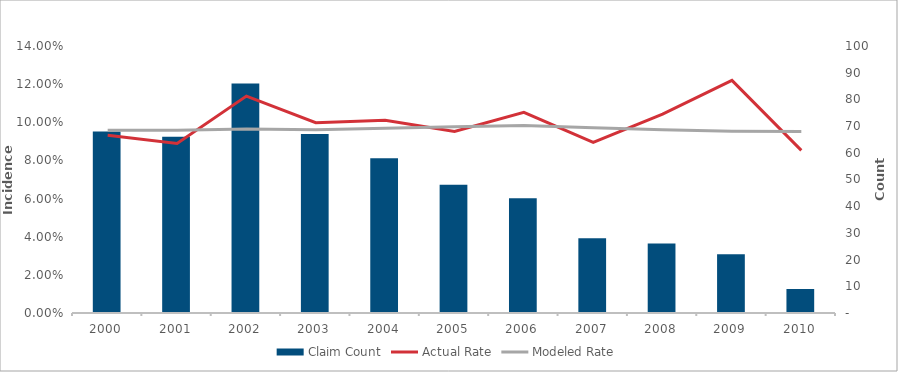
| Category | Claim Count |
|---|---|
| 2000.0 | 68 |
| 2001.0 | 66 |
| 2002.0 | 86 |
| 2003.0 | 67 |
| 2004.0 | 58 |
| 2005.0 | 48 |
| 2006.0 | 43 |
| 2007.0 | 28 |
| 2008.0 | 26 |
| 2009.0 | 22 |
| 2010.0 | 9 |